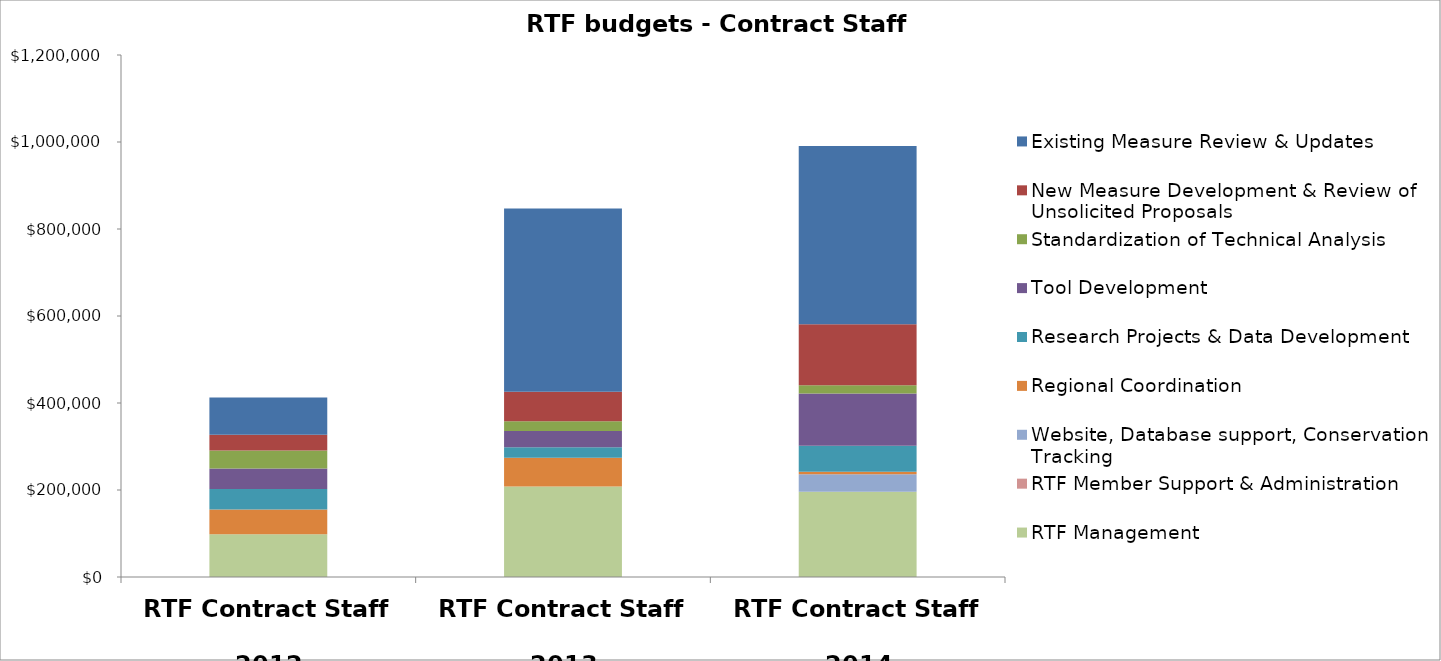
| Category | RTF Management | RTF Member Support & Administration | Website, Database support, Conservation Tracking  | Regional Coordination | Research Projects & Data Development | Tool Development | Standardization of Technical Analysis | New Measure Development & Review of Unsolicited Proposals | Existing Measure Review & Updates |
|---|---|---|---|---|---|---|---|---|---|
| RTF Contract Staff 
2012 | 98200 | 0 | 0 | 56956 | 47136 | 47136 | 41244 | 36334 | 85434 |
| RTF Contract Staff 
2013 | 208184 | 0 | 0 | 65794 | 24451.8 | 37316 | 22095 | 67758 | 421376.2 |
| RTF Contract Staff 
2014 | 196000 | 0 | 40000 | 6000 | 60000 | 120000 | 19000 | 140000 | 410000 |